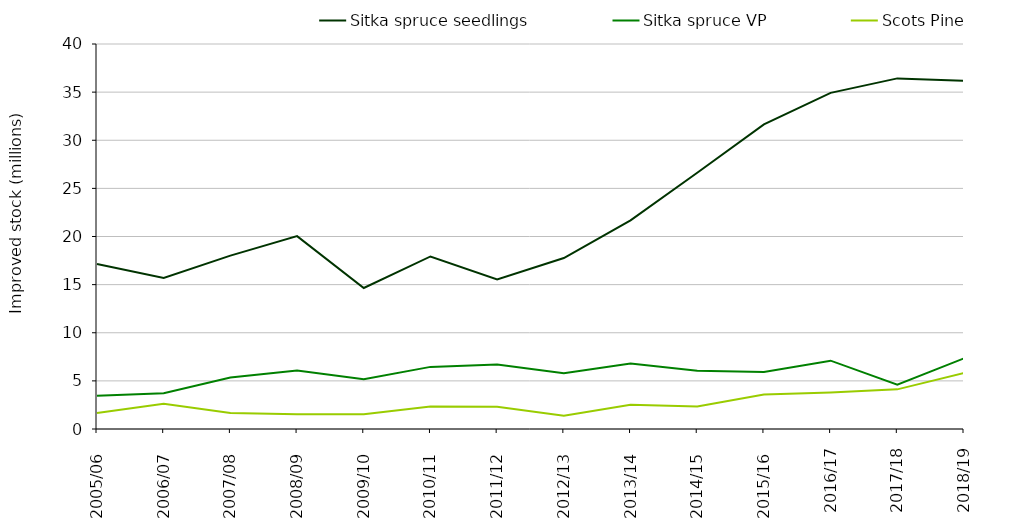
| Category | Sitka spruce seedlings | Sitka spruce VP | Scots Pine |
|---|---|---|---|
| 2005/06  | 17.152 | 3.459 | 1.664 |
| 2006/07  | 15.691 | 3.71 | 2.616 |
| 2007/08  | 18.015 | 5.34 | 1.665 |
| 2008/09  | 20.037 | 6.065 | 1.523 |
| 2009/10  | 14.651 | 5.17 | 1.543 |
| 2010/11  | 17.926 | 6.454 | 2.35 |
| 2011/12  | 15.549 | 6.699 | 2.32 |
| 2012/13  | 17.758 | 5.786 | 1.379 |
| 2013/14  | 21.674 | 6.814 | 2.526 |
| 2014/15  | 26.629 | 6.049 | 2.345 |
| 2015/16  | 31.65 | 5.931 | 3.575 |
| 2016/17 | 34.924 | 7.1 | 3.783 |
| 2017/18 | 36.426 | 4.6 | 4.119 |
| 2018/19 | 36.168 | 7.336 | 5.812 |